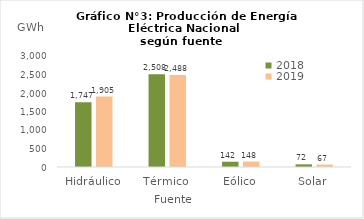
| Category | 2018 | 2019 |
|---|---|---|
| Hidráulico | 1747.143 | 1904.734 |
| Térmico | 2507.914 | 2487.834 |
| Eólico | 142.482 | 147.804 |
| Solar | 71.771 | 67.235 |